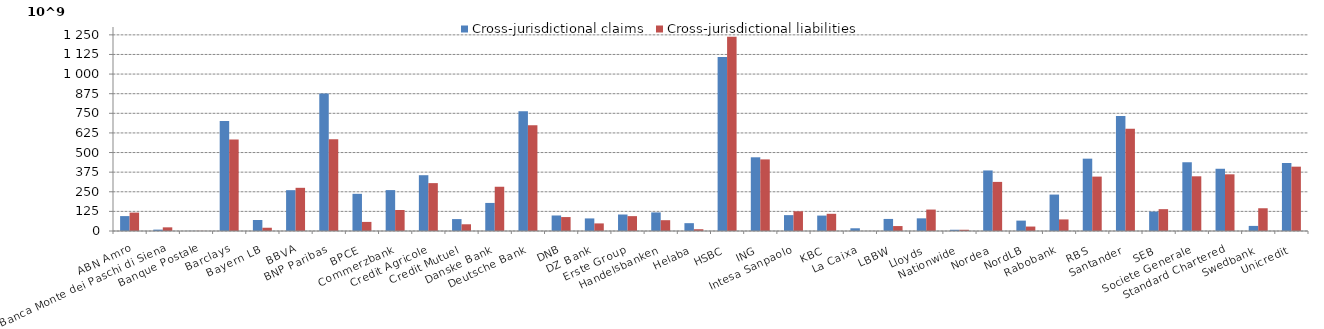
| Category | Cross-jurisdictional claims | Cross-jurisdictional liabilities |
|---|---|---|
| ABN Amro | 94970.361 | 117309.071 |
| Banca Monte dei Paschi di Siena | 8804.166 | 23336.519 |
| Banque Postale | 557.886 | 557.886 |
| Barclays | 701445.364 | 583873.016 |
| Bayern LB | 70053.711 | 20748.712 |
| BBVA | 260238.663 | 275213.945 |
| BNP Paribas | 876694.955 | 584177.379 |
| BPCE | 236908 | 57925 |
| Commerzbank | 260690 | 133954 |
| Credit Agricole | 355550 | 305124 |
| Credit Mutuel | 75917.623 | 42869.133 |
| Danske Bank | 178818.053 | 281982.44 |
| Deutsche Bank | 762580.206 | 674204.627 |
| DNB | 98883.176 | 88838.904 |
| DZ Bank | 80159.859 | 48387.759 |
| Erste Group | 105063.302 | 94755.839 |
| Handelsbanken | 118384.053 | 68878.146 |
| Helaba | 49946.221 | 11287.686 |
| HSBC | 1109379.888 | 1238647.071 |
| ING | 469701 | 456301 |
| Intesa Sanpaolo | 101155 | 125619 |
| KBC | 98266 | 109623 |
| La Caixa | 17367.193 | 43.866 |
| LBBW | 76883.712 | 31478.995 |
| Lloyds | 80653.712 | 136637.879 |
| Nationwide | 7904.522 | 7903.323 |
| Nordea | 385793 | 312891 |
| NordLB | 66154.289 | 28385.895 |
| Rabobank | 232168 | 73823 |
| RBS | 460958.378 | 346654.672 |
| Santander | 732557.542 | 651697.604 |
| SEB | 123824.711 | 139191.328 |
| Societe Generale | 438088 | 348589.91 |
| Standard Chartered | 396599.956 | 361186.281 |
| Swedbank | 32446.085 | 144960.3 |
| Unicredit | 433361.885 | 410000.178 |